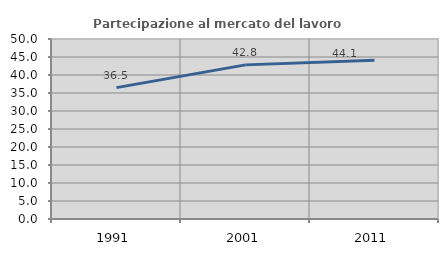
| Category | Partecipazione al mercato del lavoro  femminile |
|---|---|
| 1991.0 | 36.495 |
| 2001.0 | 42.812 |
| 2011.0 | 44.065 |